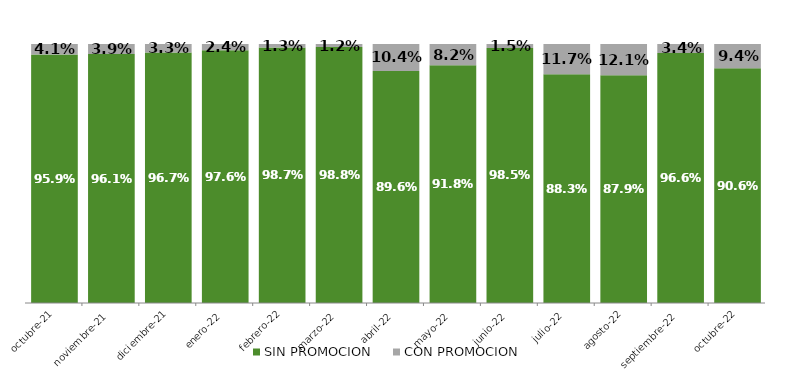
| Category | SIN PROMOCION   | CON PROMOCION   |
|---|---|---|
| 2021-10-01 | 0.959 | 0.041 |
| 2021-11-01 | 0.961 | 0.039 |
| 2021-12-01 | 0.967 | 0.033 |
| 2022-01-01 | 0.976 | 0.024 |
| 2022-02-01 | 0.987 | 0.013 |
| 2022-03-01 | 0.988 | 0.012 |
| 2022-04-01 | 0.896 | 0.104 |
| 2022-05-01 | 0.918 | 0.082 |
| 2022-06-01 | 0.985 | 0.015 |
| 2022-07-01 | 0.883 | 0.117 |
| 2022-08-01 | 0.879 | 0.121 |
| 2022-09-01 | 0.966 | 0.034 |
| 2022-10-01 | 0.906 | 0.094 |